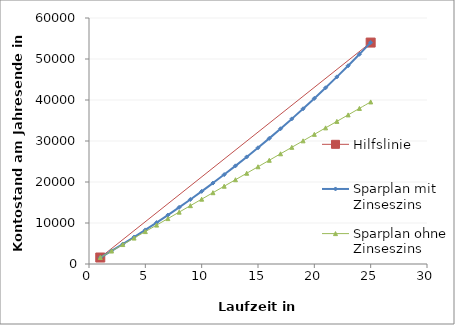
| Category | Hilfslinie |
|---|---|
| 1.0 | 1581.125 |
| 25.0 | 54007.694 |